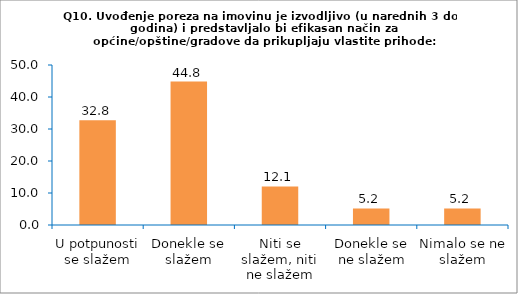
| Category | Series 0 |
|---|---|
| U potpunosti se slažem | 32.759 |
| Donekle se slažem | 44.828 |
| Niti se slažem, niti ne slažem | 12.069 |
| Donekle se ne slažem | 5.172 |
| Nimalo se ne slažem | 5.172 |